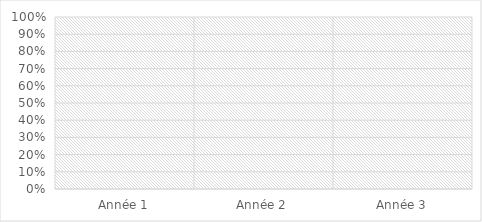
| Category | Score Besoins |
|---|---|
| Année 1 | 0 |
| Année 2 | 0 |
| Année 3 | 0 |